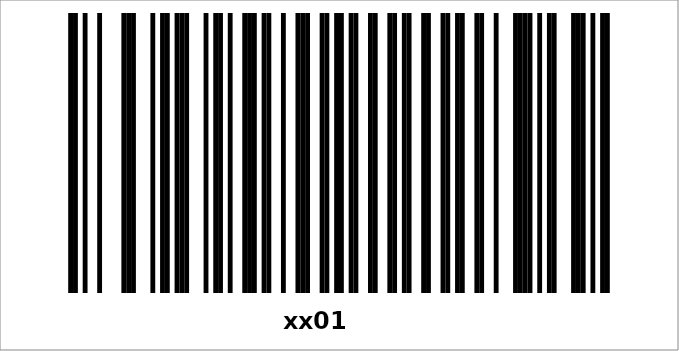
| Category | xx01        |
|---|---|
| 0 | 0 |
| 1 | 0 |
| 2 | 0 |
| 3 | 0 |
| 4 | 0 |
| 5 | 0 |
| 6 | 0 |
| 7 | 0 |
| 8 | 0 |
| 9 | 0 |
| 10 | 0 |
| 11 | 1 |
| 12 | 1 |
| 13 | 0 |
| 14 | 1 |
| 15 | 0 |
| 16 | 0 |
| 17 | 1 |
| 18 | 0 |
| 19 | 0 |
| 20 | 0 |
| 21 | 0 |
| 22 | 1 |
| 23 | 1 |
| 24 | 1 |
| 25 | 0 |
| 26 | 0 |
| 27 | 0 |
| 28 | 1 |
| 29 | 0 |
| 30 | 1 |
| 31 | 1 |
| 32 | 0 |
| 33 | 1 |
| 34 | 1 |
| 35 | 1 |
| 36 | 0 |
| 37 | 0 |
| 38 | 0 |
| 39 | 1 |
| 40 | 0 |
| 41 | 1 |
| 42 | 1 |
| 43 | 0 |
| 44 | 1 |
| 45 | 0 |
| 46 | 0 |
| 47 | 1 |
| 48 | 1 |
| 49 | 1 |
| 50 | 0 |
| 51 | 1 |
| 52 | 1 |
| 53 | 0 |
| 54 | 0 |
| 55 | 1 |
| 56 | 0 |
| 57 | 0 |
| 58 | 1 |
| 59 | 1 |
| 60 | 1 |
| 61 | 0 |
| 62 | 0 |
| 63 | 1 |
| 64 | 1 |
| 65 | 0 |
| 66 | 1 |
| 67 | 1 |
| 68 | 0 |
| 69 | 1 |
| 70 | 1 |
| 71 | 0 |
| 72 | 0 |
| 73 | 1 |
| 74 | 1 |
| 75 | 0 |
| 76 | 0 |
| 77 | 1 |
| 78 | 1 |
| 79 | 0 |
| 80 | 1 |
| 81 | 1 |
| 82 | 0 |
| 83 | 0 |
| 84 | 1 |
| 85 | 1 |
| 86 | 0 |
| 87 | 0 |
| 88 | 1 |
| 89 | 1 |
| 90 | 0 |
| 91 | 1 |
| 92 | 1 |
| 93 | 0 |
| 94 | 0 |
| 95 | 1 |
| 96 | 1 |
| 97 | 0 |
| 98 | 0 |
| 99 | 1 |
| 100 | 0 |
| 101 | 0 |
| 102 | 0 |
| 103 | 1 |
| 104 | 1 |
| 105 | 1 |
| 106 | 1 |
| 107 | 0 |
| 108 | 1 |
| 109 | 0 |
| 110 | 1 |
| 111 | 1 |
| 112 | 0 |
| 113 | 0 |
| 114 | 0 |
| 115 | 1 |
| 116 | 1 |
| 117 | 1 |
| 118 | 0 |
| 119 | 1 |
| 120 | 0 |
| 121 | 1 |
| 122 | 1 |
| 123 | 0 |
| 124 | 0 |
| 125 | 0 |
| 126 | 0 |
| 127 | 0 |
| 128 | 0 |
| 129 | 0 |
| 130 | 0 |
| 131 | 0 |
| 132 | 0 |
| 133 | 0 |